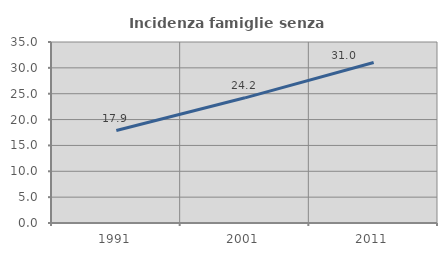
| Category | Incidenza famiglie senza nuclei |
|---|---|
| 1991.0 | 17.882 |
| 2001.0 | 24.205 |
| 2011.0 | 31.048 |